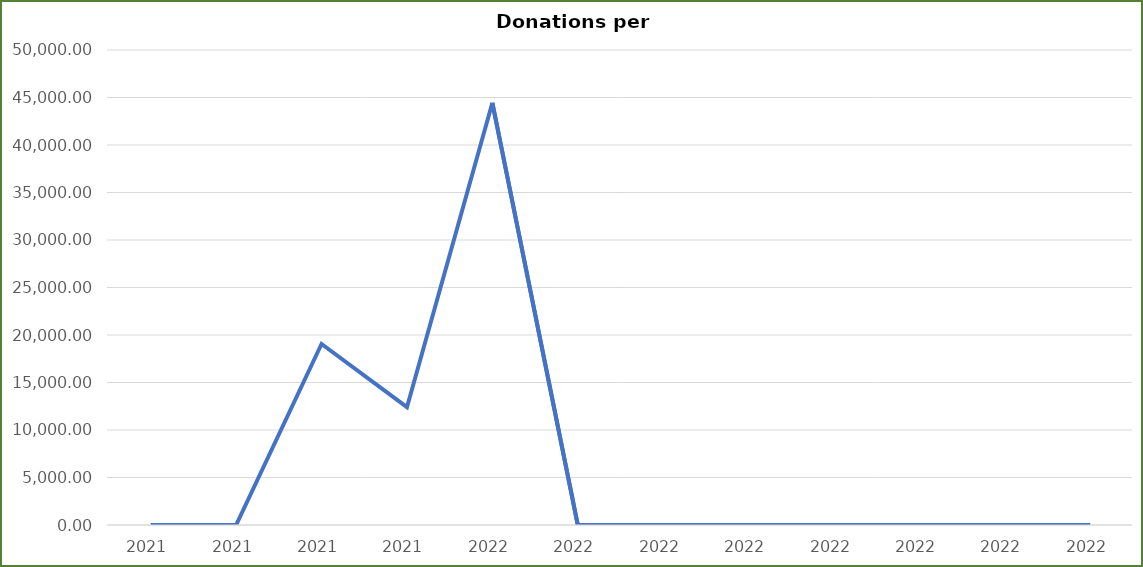
| Category | Series 0 |
|---|---|
| 2021.0 | 0 |
| 2021.0 | 0 |
| 2021.0 | 0 |
| 2021.0 | 0 |
| 2022.0 | 0 |
| 2022.0 | 0 |
| 2022.0 | 0 |
| 2022.0 | 0 |
| 2022.0 | 0 |
| 2022.0 | 0 |
| 2022.0 | 0 |
| 2022.0 | 0 |